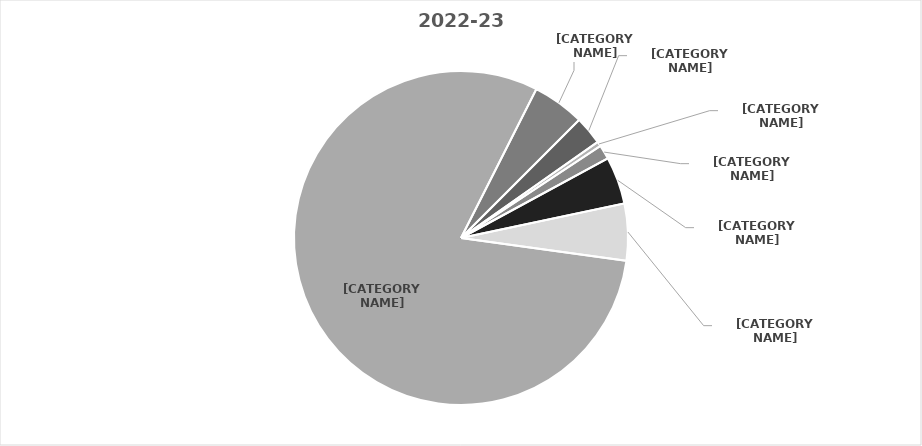
| Category | 2022-23 |
|---|---|
| Domestic Not Supplied | 6 |
| American Indian/ Alaskan Native | 1 |
| African American/ Non Hispanic | 3 |
| Asian/ Asian American** | 10 |
| Hispanic/ Hispanic American | 12 |
| White/ Non Hispanic | 175 |
| Multi Racial | 11 |